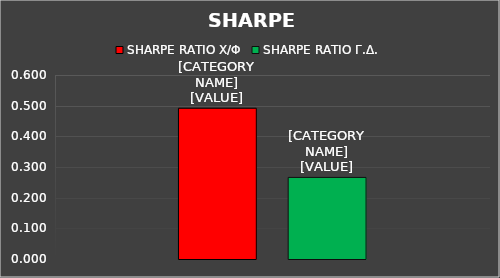
| Category | SHARPE RATIO Χ/Φ | SHARPE RATIO Γ.Δ. |
|---|---|---|
|  | 0.492 | 0.266 |